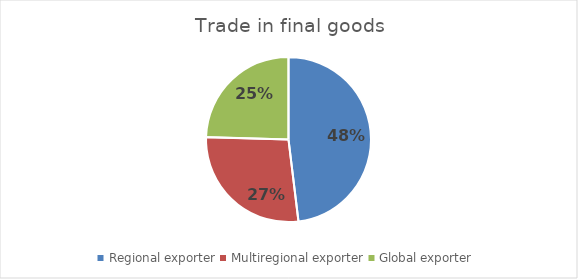
| Category | Trade in final goods |
|---|---|
| Regional exporter | 0.481 |
| Multiregional exporter | 0.274 |
| Global exporter | 0.246 |